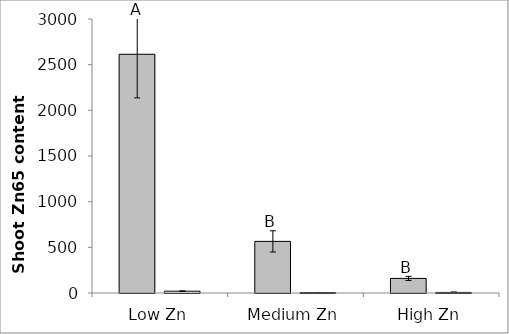
| Category | 76R | rmc |
|---|---|---|
| Low Zn | 2613.725 | 19.838 |
| Medium Zn | 565.076 | 4.571 |
| High Zn | 159.653 | 6.436 |